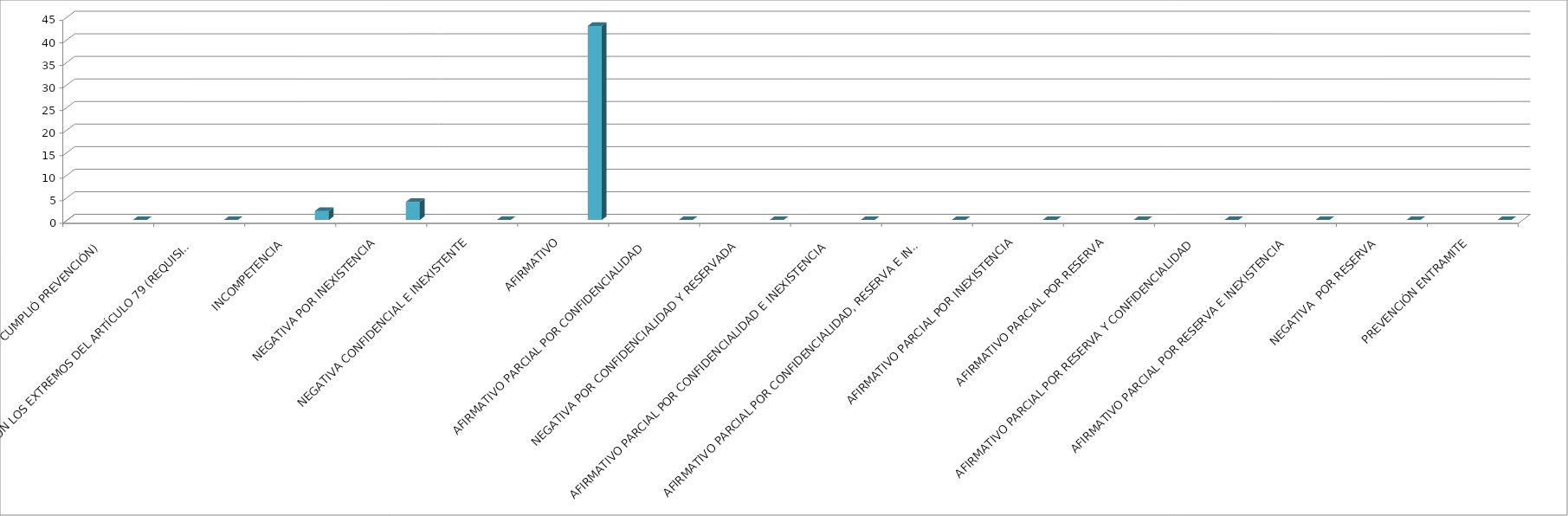
| Category | Series 0 | Series 1 | Series 2 | Series 3 | Series 4 |
|---|---|---|---|---|---|
| SE TIENE POR NO PRESENTADA ( NO CUMPLIÓ PREVENCIÓN) |  |  |  |  | 0 |
| NO CUMPLIO CON LOS EXTREMOS DEL ARTÍCULO 79 (REQUISITOS) |  |  |  |  | 0 |
| INCOMPETENCIA  |  |  |  |  | 2 |
| NEGATIVA POR INEXISTENCIA |  |  |  |  | 4 |
| NEGATIVA CONFIDENCIAL E INEXISTENTE |  |  |  |  | 0 |
| AFIRMATIVO |  |  |  |  | 43 |
| AFIRMATIVO PARCIAL POR CONFIDENCIALIDAD  |  |  |  |  | 0 |
| NEGATIVA POR CONFIDENCIALIDAD Y RESERVADA |  |  |  |  | 0 |
| AFIRMATIVO PARCIAL POR CONFIDENCIALIDAD E INEXISTENCIA |  |  |  |  | 0 |
| AFIRMATIVO PARCIAL POR CONFIDENCIALIDAD, RESERVA E INEXISTENCIA |  |  |  |  | 0 |
| AFIRMATIVO PARCIAL POR INEXISTENCIA |  |  |  |  | 0 |
| AFIRMATIVO PARCIAL POR RESERVA |  |  |  |  | 0 |
| AFIRMATIVO PARCIAL POR RESERVA Y CONFIDENCIALIDAD |  |  |  |  | 0 |
| AFIRMATIVO PARCIAL POR RESERVA E INEXISTENCIA |  |  |  |  | 0 |
| NEGATIVA  POR RESERVA |  |  |  |  | 0 |
| PREVENCIÓN ENTRAMITE |  |  |  |  | 0 |